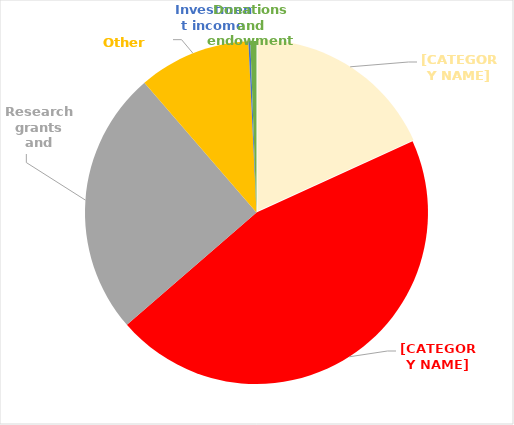
| Category | Series 0 |
|---|---|
| Funding body grants | 73762 |
| Tuition fees and education contracts | 184277 |
| Research grants and contracts | 101483 |
| Other income | 42917 |
| Investment income | 732 |
| Donations and endowments | 2322 |